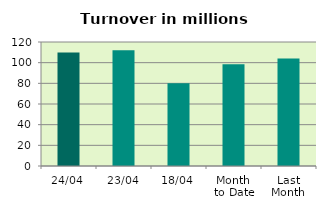
| Category | Series 0 |
|---|---|
| 24/04 | 109.777 |
| 23/04 | 112.006 |
| 18/04 | 80.009 |
| Month 
to Date | 98.393 |
| Last
Month | 104.085 |